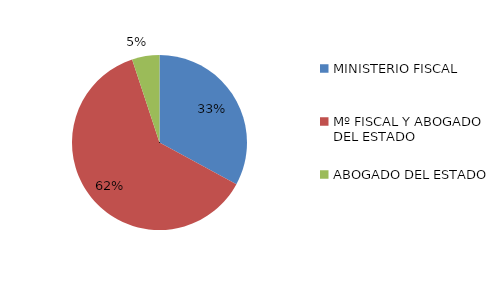
| Category | Series 0 |
|---|---|
| MINISTERIO FISCAL | 26 |
| Mº FISCAL Y ABOGADO DEL ESTADO | 49 |
| ABOGADO DEL ESTADO | 4 |